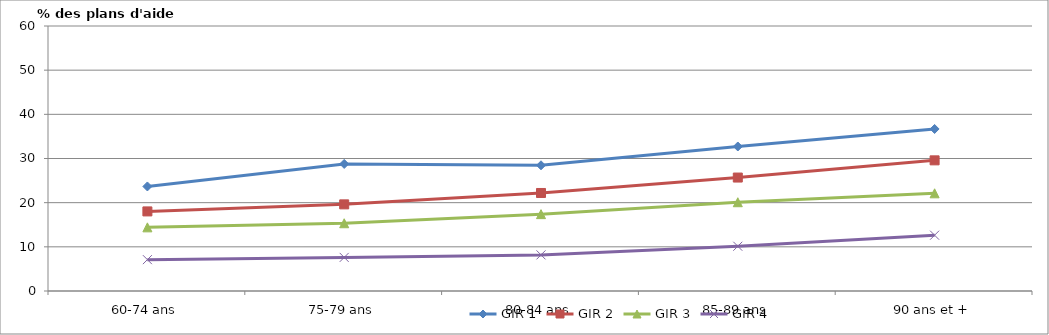
| Category | GIR 1 | GIR 2 | GIR 3 | GIR 4 |
|---|---|---|---|---|
| 60-74 ans | 23.668 | 18.019 | 14.41 | 7.099 |
| 75-79 ans | 28.766 | 19.615 | 15.342 | 7.609 |
| 80-84 ans | 28.464 | 22.195 | 17.403 | 8.177 |
| 85-89 ans | 32.718 | 25.687 | 20.099 | 10.133 |
| 90 ans et + | 36.685 | 29.582 | 22.116 | 12.636 |